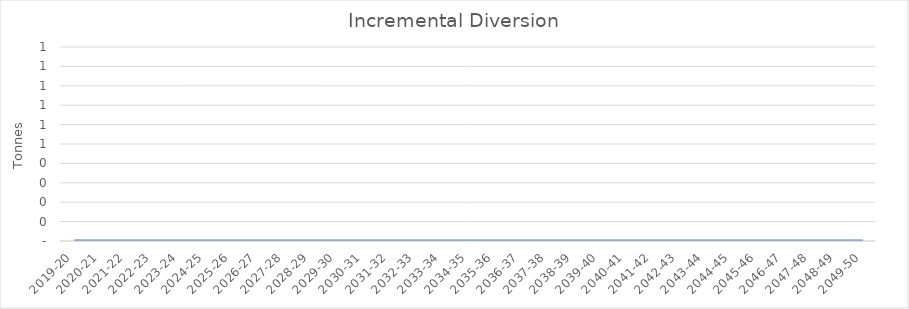
| Category | Series 0 |
|---|---|
| 2019-20 | 0 |
| 2020-21 | 0 |
| 2021-22 | 0 |
| 2022-23 | 0 |
| 2023-24 | 0 |
| 2024-25 | 0 |
| 2025-26 | 0 |
| 2026-27 | 0 |
| 2027-28 | 0 |
| 2028-29 | 0 |
| 2029-30 | 0 |
| 2030-31 | 0 |
| 2031-32 | 0 |
| 2032-33 | 0 |
| 2033-34 | 0 |
| 2034-35 | 0 |
| 2035-36 | 0 |
| 2036-37 | 0 |
| 2037-38 | 0 |
| 2038-39 | 0 |
| 2039-40 | 0 |
| 2040-41 | 0 |
| 2041-42 | 0 |
| 2042-43 | 0 |
| 2043-44 | 0 |
| 2044-45 | 0 |
| 2045-46 | 0 |
| 2046-47 | 0 |
| 2047-48 | 0 |
| 2048-49 | 0 |
| 2049-50 | 0 |